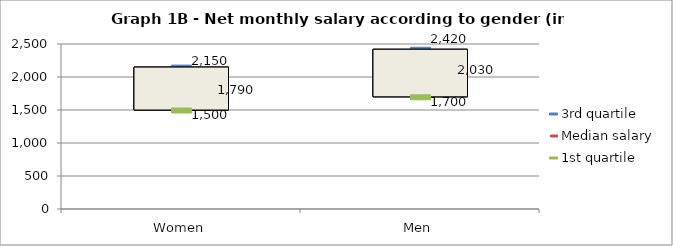
| Category | 3rd quartile | Median salary | 1st quartile |
|---|---|---|---|
| Women | 2150 | 1790 | 1500 |
| Men | 2420 | 2030 | 1700 |